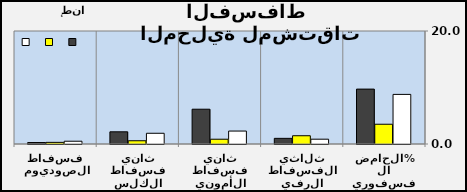
| Category | Series 2 | Series 0 | Series 1 |
|---|---|---|---|
| الحامض الفسفوري 54% | 8.78 | 3.496 | 9.717 |
| ثلاثي الفسفاط الرفيع | 0.851 | 1.461 | 1 |
| ثاني فسفاط الأمونيا | 2.29 | 0.845 | 6.156 |
| ثاني فسفاط الكلس | 1.899 | 0.575 | 2.158 |
| فسفاط الصوديوم  | 0.49 | 0.288 | 0.262 |